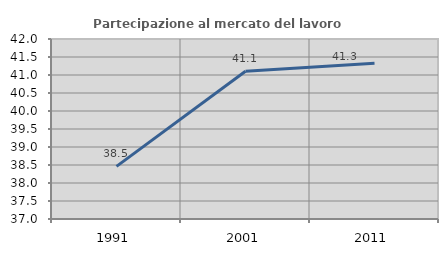
| Category | Partecipazione al mercato del lavoro  femminile |
|---|---|
| 1991.0 | 38.462 |
| 2001.0 | 41.105 |
| 2011.0 | 41.329 |